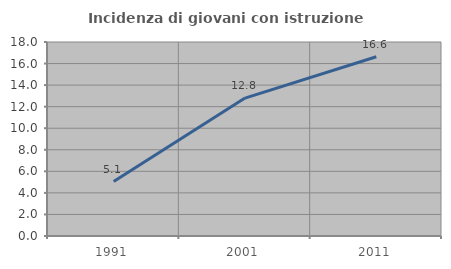
| Category | Incidenza di giovani con istruzione universitaria |
|---|---|
| 1991.0 | 5.053 |
| 2001.0 | 12.799 |
| 2011.0 | 16.632 |